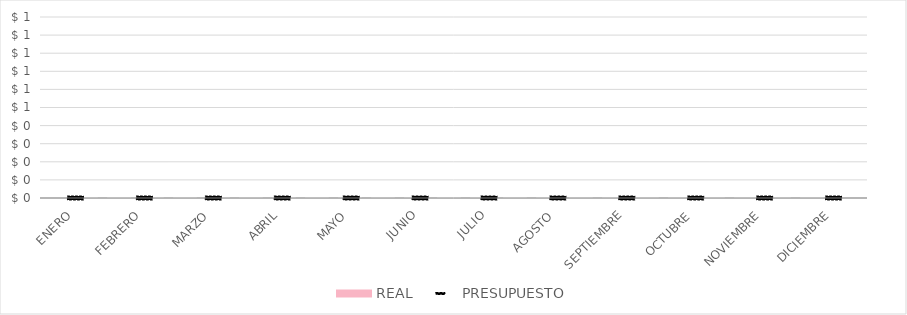
| Category | REAL |
|---|---|
| ENERO | 0 |
| FEBRERO | 0 |
| MARZO | 0 |
| ABRIL | 0 |
| MAYO | 0 |
| JUNIO | 0 |
| JULIO | 0 |
| AGOSTO | 0 |
| SEPTIEMBRE | 0 |
| OCTUBRE | 0 |
| NOVIEMBRE | 0 |
| DICIEMBRE | 0 |